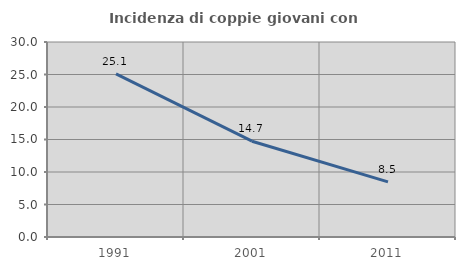
| Category | Incidenza di coppie giovani con figli |
|---|---|
| 1991.0 | 25.093 |
| 2001.0 | 14.74 |
| 2011.0 | 8.488 |